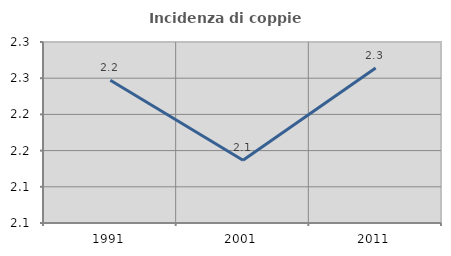
| Category | Incidenza di coppie miste |
|---|---|
| 1991.0 | 2.247 |
| 2001.0 | 2.137 |
| 2011.0 | 2.264 |